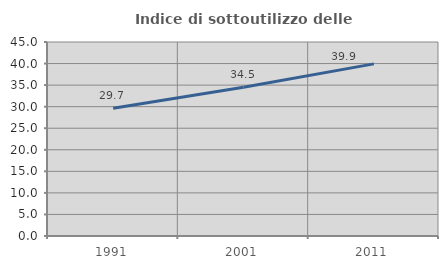
| Category | Indice di sottoutilizzo delle abitazioni  |
|---|---|
| 1991.0 | 29.657 |
| 2001.0 | 34.511 |
| 2011.0 | 39.926 |